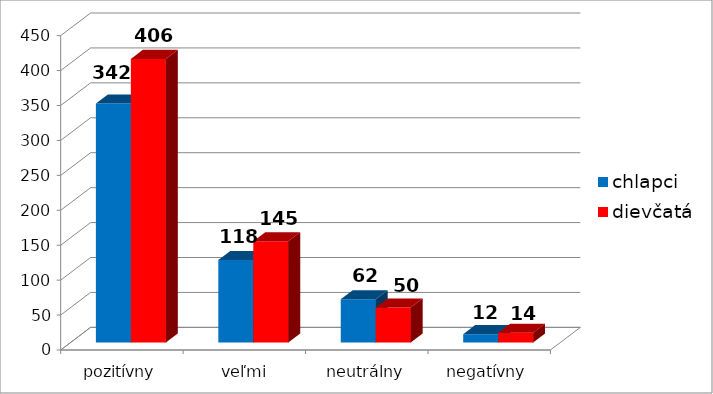
| Category | chlapci | dievčatá |
|---|---|---|
| pozitívny | 342 | 406 |
| veľmi pozitívny | 118 | 145 |
| neutrálny | 62 | 50 |
| negatívny | 12 | 14 |